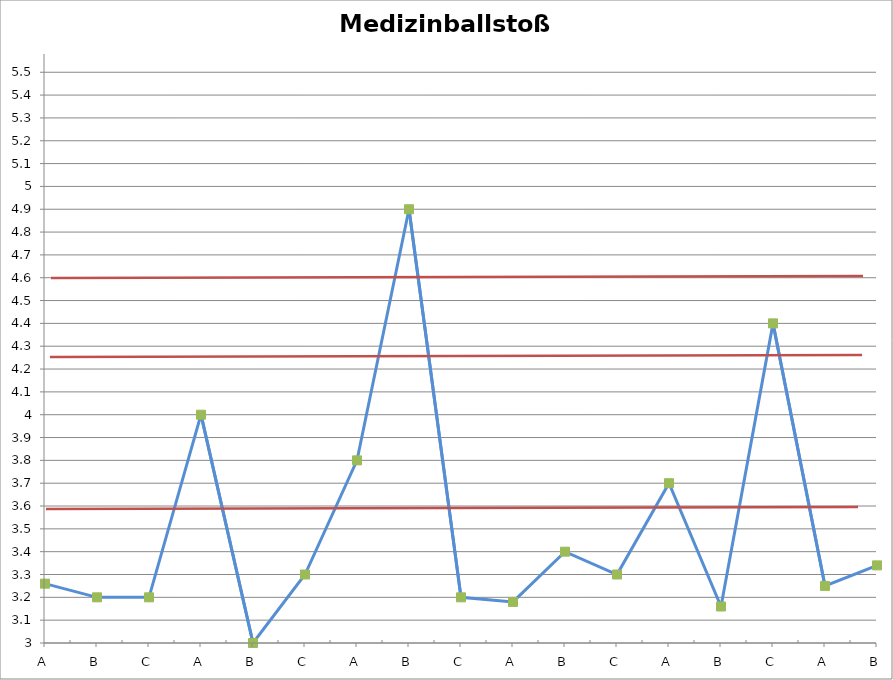
| Category | Medizinballstoßen |
|---|---|
| A | 3.26 |
| B | 3.2 |
| C | 3.2 |
| A | 4 |
| B | 3 |
| C | 3.3 |
| A | 3.8 |
| B | 4.9 |
| C | 3.2 |
| A | 3.18 |
| B | 3.4 |
| C | 3.3 |
| A | 3.7 |
| B | 3.16 |
| C | 4.4 |
| A | 3.25 |
| B | 3.34 |